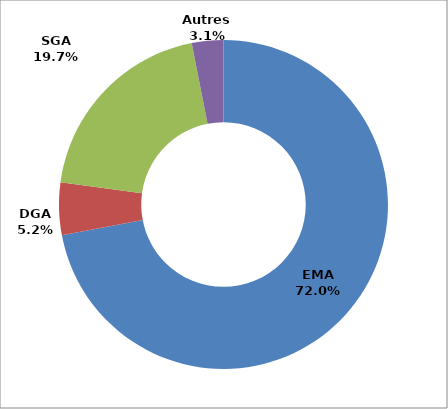
| Category | Series 0 |
|---|---|
| EMA | 2415 |
| DGA | 173 |
| SGA | 662 |
| Autres | 104 |